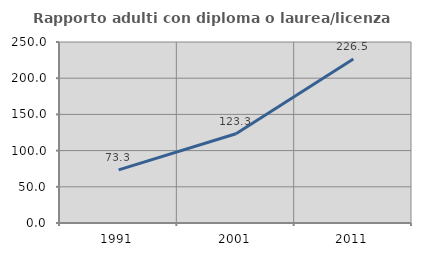
| Category | Rapporto adulti con diploma o laurea/licenza media  |
|---|---|
| 1991.0 | 73.288 |
| 2001.0 | 123.288 |
| 2011.0 | 226.496 |